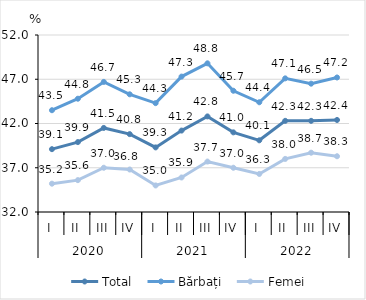
| Category | Total | Bărbați | Femei |
|---|---|---|---|
| 0 | 39.1 | 43.5 | 35.2 |
| 1 | 39.9 | 44.8 | 35.6 |
| 2 | 41.5 | 46.7 | 37 |
| 3 | 40.8 | 45.3 | 36.8 |
| 4 | 39.3 | 44.3 | 35 |
| 5 | 41.2 | 47.3 | 35.9 |
| 6 | 42.8 | 48.8 | 37.7 |
| 7 | 41 | 45.7 | 37 |
| 8 | 40.1 | 44.4 | 36.3 |
| 9 | 42.3 | 47.1 | 38 |
| 10 | 42.3 | 46.5 | 38.7 |
| 11 | 42.4 | 47.2 | 38.3 |